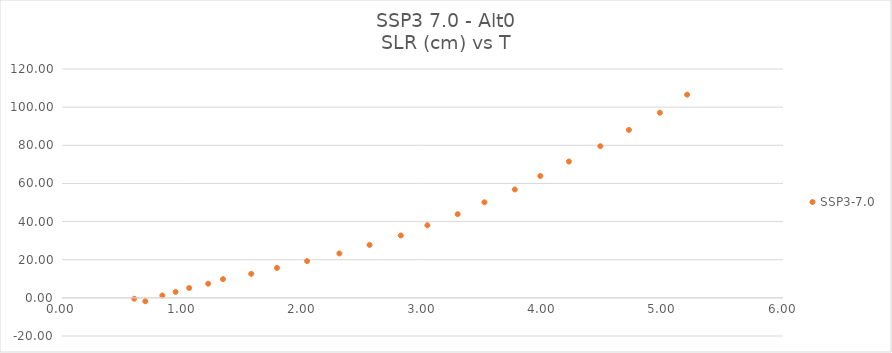
| Category | SSP3-7.0 |
|---|---|
| 0.693400617 | -1.781 |
| 0.600872844 | -0.455 |
| 0.835003234 | 1.253 |
| 0.945258389 | 3.132 |
| 1.057970477 | 5.16 |
| 1.216178519 | 7.412 |
| 1.339886213 | 9.814 |
| 1.574396823 | 12.59 |
| 1.788818287 | 15.709 |
| 2.03954175 | 19.254 |
| 2.308309197 | 23.278 |
| 2.559346346 | 27.752 |
| 2.819310823 | 32.707 |
| 3.040342572 | 38.056 |
| 3.292401005 | 43.878 |
| 3.515249209 | 50.107 |
| 3.767933703 | 56.818 |
| 3.980278791 | 63.914 |
| 4.218160448 | 71.46 |
| 4.479646462 | 79.523 |
| 4.717710917 | 88.044 |
| 4.97521215 | 97.077 |
| 5.202190983 | 106.541 |